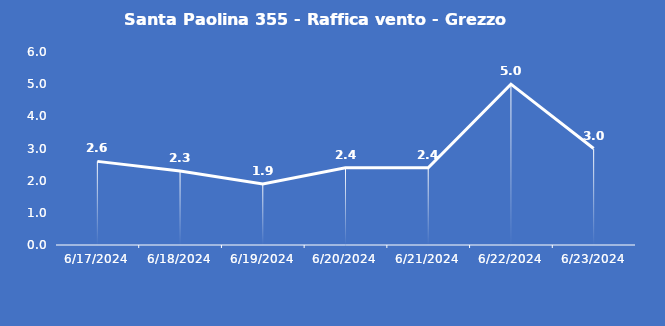
| Category | Santa Paolina 355 - Raffica vento - Grezzo (m/s) |
|---|---|
| 6/17/24 | 2.6 |
| 6/18/24 | 2.3 |
| 6/19/24 | 1.9 |
| 6/20/24 | 2.4 |
| 6/21/24 | 2.4 |
| 6/22/24 | 5 |
| 6/23/24 | 3 |